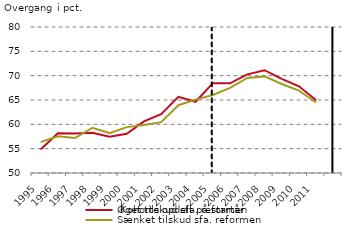
| Category | Øget tilskud sfa. reformen | Sænket tilskud sfa. reformen |
|---|---|---|
| 1995.0 | 54.821 | 56.354 |
| 1996.0 | 58.185 | 57.528 |
| 1997.0 | 58.1 | 57.185 |
| 1998.0 | 58.264 | 59.297 |
| 1999.0 | 57.444 | 58.203 |
| 2000.0 | 58.068 | 59.429 |
| 2001.0 | 60.606 | 59.88 |
| 2002.0 | 62.072 | 60.452 |
| 2003.0 | 65.641 | 63.927 |
| 2004.0 | 64.637 | 65.071 |
| 2005.0 | 68.46 | 66.024 |
| 2006.0 | 68.425 | 67.493 |
| 2007.0 | 70.27 | 69.541 |
| 2008.0 | 71.122 | 69.852 |
| 2009.0 | 69.344 | 68.285 |
| 2010.0 | 67.81 | 66.932 |
| 2011.0 | 64.944 | 64.486 |